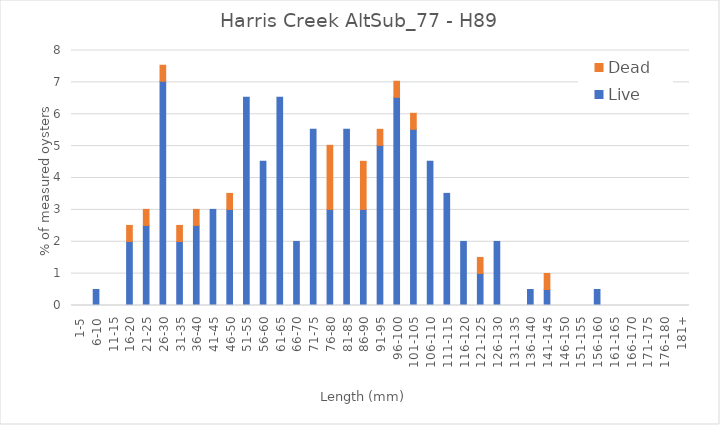
| Category | Live | Dead |
|---|---|---|
| 1-5 | 0 | 0 |
| 6-10 | 0.503 | 0 |
| 11-15 | 0 | 0 |
| 16-20 | 2.01 | 0.503 |
| 21-25 | 2.513 | 0.503 |
| 26-30 | 7.035 | 0.503 |
| 31-35 | 2.01 | 0.503 |
| 36-40 | 2.513 | 0.503 |
| 41-45 | 3.015 | 0 |
| 46-50 | 3.015 | 0.503 |
| 51-55 | 6.533 | 0 |
| 56-60 | 4.523 | 0 |
| 61-65 | 6.533 | 0 |
| 66-70 | 2.01 | 0 |
| 71-75 | 5.528 | 0 |
| 76-80 | 3.015 | 2.01 |
| 81-85 | 5.528 | 0 |
| 86-90 | 3.015 | 1.508 |
| 91-95 | 5.025 | 0.503 |
| 96-100 | 6.533 | 0.503 |
| 101-105 | 5.528 | 0.503 |
| 106-110 | 4.523 | 0 |
| 111-115 | 3.518 | 0 |
| 116-120 | 2.01 | 0 |
| 121-125 | 1.005 | 0.503 |
| 126-130 | 2.01 | 0 |
| 131-135 | 0 | 0 |
| 136-140 | 0.503 | 0 |
| 141-145 | 0.503 | 0.503 |
| 146-150 | 0 | 0 |
| 151-155 | 0 | 0 |
| 156-160 | 0.503 | 0 |
| 161-165 | 0 | 0 |
| 166-170 | 0 | 0 |
| 171-175 | 0 | 0 |
| 176-180 | 0 | 0 |
| 181+ | 0 | 0 |